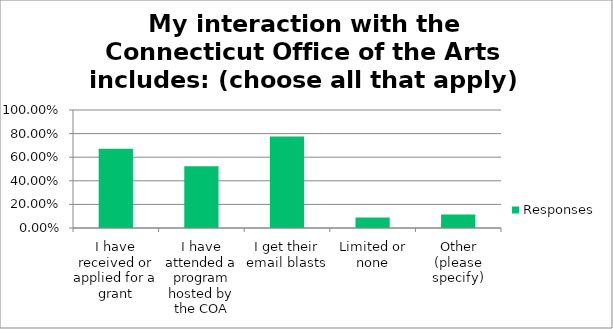
| Category | Responses |
|---|---|
| I have received or applied for a grant | 0.671 |
| I have attended a program hosted by the COA | 0.524 |
| I get their email blasts | 0.776 |
| Limited or none | 0.09 |
| Other (please specify) | 0.115 |